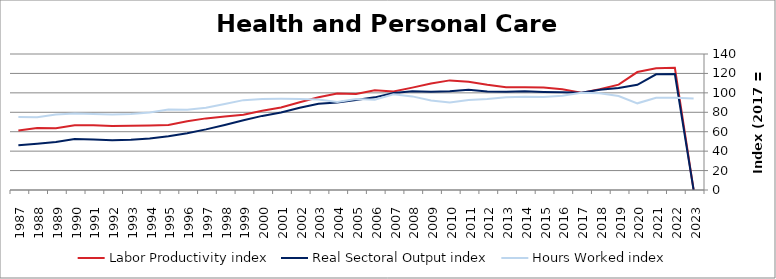
| Category | Labor Productivity index | Real Sectoral Output index | Hours Worked index |
|---|---|---|---|
| 2023.0 | 0 | 0 | 94.091 |
| 2022.0 | 125.867 | 119.428 | 94.884 |
| 2021.0 | 125.432 | 119.084 | 94.939 |
| 2020.0 | 121.417 | 108.329 | 89.221 |
| 2019.0 | 108.495 | 104.983 | 96.762 |
| 2018.0 | 103.701 | 103.263 | 99.578 |
| 2017.0 | 100 | 100 | 100 |
| 2016.0 | 103.628 | 100.666 | 97.141 |
| 2015.0 | 105.427 | 100.997 | 95.798 |
| 2014.0 | 105.816 | 101.643 | 96.056 |
| 2013.0 | 105.821 | 101.053 | 95.494 |
| 2012.0 | 108.279 | 101.396 | 93.643 |
| 2011.0 | 111.457 | 103.149 | 92.545 |
| 2010.0 | 112.843 | 101.576 | 90.016 |
| 2009.0 | 109.679 | 101.133 | 92.209 |
| 2008.0 | 105.392 | 101.562 | 96.365 |
| 2007.0 | 101.299 | 99.741 | 98.462 |
| 2006.0 | 102.672 | 95.372 | 92.889 |
| 2005.0 | 98.909 | 92.615 | 93.636 |
| 2004.0 | 99.376 | 89.972 | 90.537 |
| 2003.0 | 95.396 | 88.834 | 93.121 |
| 2002.0 | 90.354 | 84.711 | 93.754 |
| 2001.0 | 85.014 | 79.79 | 93.854 |
| 2000.0 | 81.535 | 76.282 | 93.557 |
| 1999.0 | 77.56 | 71.745 | 92.503 |
| 1998.0 | 75.626 | 66.948 | 88.525 |
| 1997.0 | 73.726 | 62.42 | 84.665 |
| 1996.0 | 70.795 | 58.474 | 82.595 |
| 1995.0 | 66.842 | 55.317 | 82.758 |
| 1994.0 | 66.324 | 52.99 | 79.895 |
| 1993.0 | 66.126 | 51.737 | 78.241 |
| 1992.0 | 65.796 | 51.186 | 77.795 |
| 1991.0 | 66.555 | 52.031 | 78.177 |
| 1990.0 | 66.719 | 52.482 | 78.662 |
| 1989.0 | 63.618 | 49.448 | 77.726 |
| 1988.0 | 63.766 | 47.72 | 74.835 |
| 1987.0 | 61.266 | 46.102 | 75.248 |